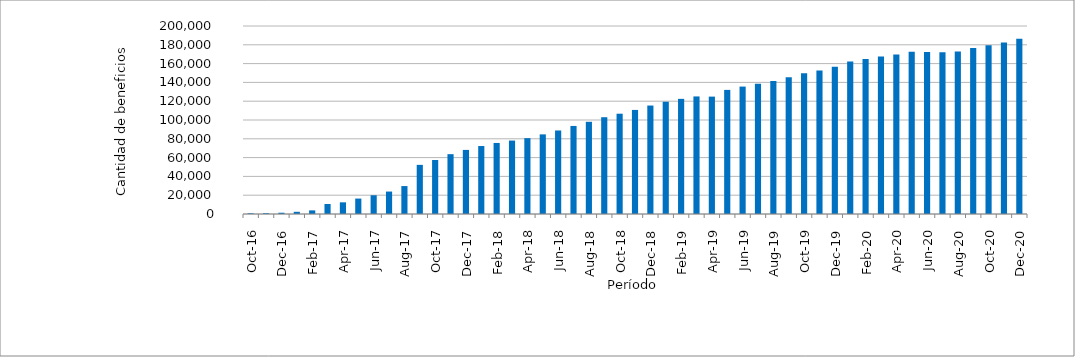
| Category | Series 0 |
|---|---|
| 2016-10-01 | 734 |
| 2016-11-01 | 840 |
| 2016-12-01 | 1355 |
| 2017-01-01 | 2338 |
| 2017-02-01 | 3845 |
| 2017-03-01 | 10612 |
| 2017-04-01 | 12409 |
| 2017-05-01 | 16412 |
| 2017-06-01 | 19947 |
| 2017-07-01 | 23878 |
| 2017-08-01 | 29715 |
| 2017-09-01 | 52268 |
| 2017-10-01 | 57452 |
| 2017-11-01 | 63653 |
| 2017-12-01 | 68183 |
| 2018-01-01 | 72302 |
| 2018-02-01 | 75570 |
| 2018-03-01 | 78119 |
| 2018-04-01 | 80700 |
| 2018-05-01 | 84709 |
| 2018-06-01 | 88857 |
| 2018-07-01 | 93664 |
| 2018-08-01 | 98093 |
| 2018-09-01 | 102951 |
| 2018-10-01 | 106684 |
| 2018-11-01 | 110711 |
| 2018-12-01 | 115377 |
| 2019-01-01 | 119439 |
| 2019-02-01 | 122487 |
| 2019-03-01 | 125066 |
| 2019-04-01 | 124881 |
| 2019-05-01 | 132024 |
| 2019-06-01 | 135562 |
| 2019-07-01 | 138695 |
| 2019-08-01 | 141520 |
| 2019-09-01 | 145544 |
| 2019-10-01 | 149853 |
| 2019-11-01 | 152682 |
| 2019-12-01 | 156763 |
| 2020-01-01 | 162294 |
| 2020-02-01 | 164917 |
| 2020-03-01 | 167596 |
| 2020-04-01 | 169701 |
| 2020-05-01 | 172647 |
| 2020-06-01 | 172356 |
| 2020-07-01 | 172197 |
| 2020-08-01 | 172994 |
| 2020-09-01 | 176483 |
| 2020-10-01 | 179635 |
| 2020-11-01 | 182359 |
| 2020-12-01 | 186384 |